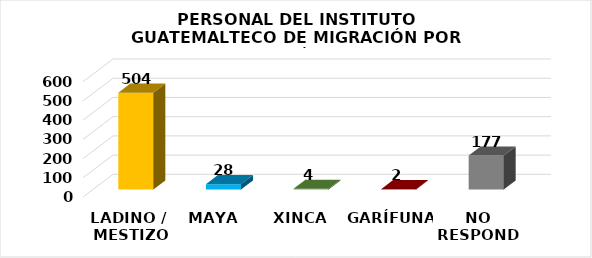
| Category | Series 0 |
|---|---|
| LADINO /
 MESTIZO | 504 |
| MAYA | 28 |
| XINCA | 4 |
| GARÍFUNA | 2 |
| NO RESPONDE | 177 |